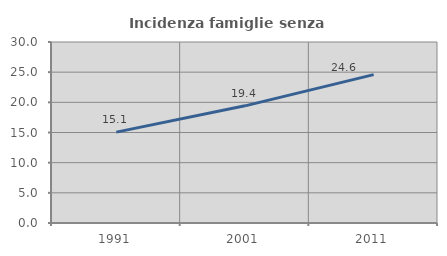
| Category | Incidenza famiglie senza nuclei |
|---|---|
| 1991.0 | 15.067 |
| 2001.0 | 19.42 |
| 2011.0 | 24.594 |